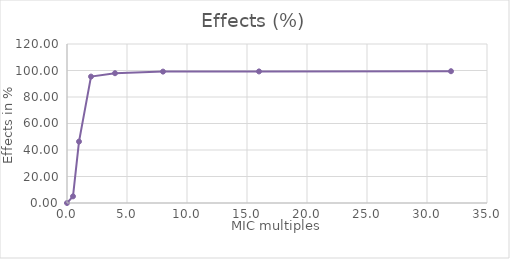
| Category | AUC0-24 |
|---|---|
| 0.0 | 0 |
| 0.5 | 5.017 |
| 1.0 | 46.341 |
| 2.0 | 95.404 |
| 4.0 | 97.958 |
| 8.0 | 99.164 |
| 16.0 | 99.297 |
| 32.0 | 99.457 |